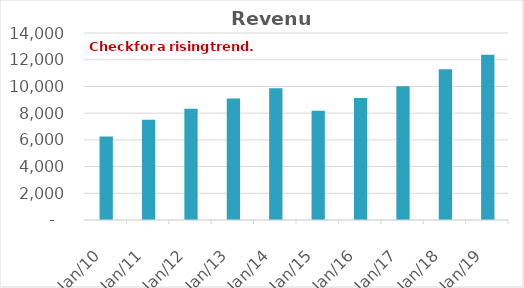
| Category | Revenue |
|---|---|
| 2010-12-31 | 6254.74 |
| 2011-12-31 | 7514.55 |
| 2012-12-31 | 8334.53 |
| 2013-12-31 | 9101.05 |
| 2014-12-31 | 9854.84 |
| 2015-12-31 | 8175.31 |
| 2016-12-31 | 9141.34 |
| 2017-12-31 | 10009.6 |
| 2018-12-31 | 11292.27 |
| 2019-12-31 | 12368.9 |